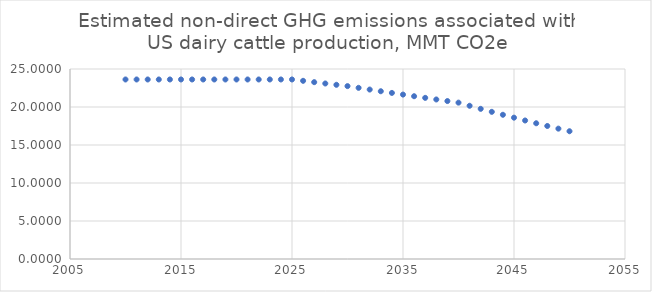
| Category | Estimated non-direct GHG emissions associated with US dairy cattle production, MMT CO2e |
|---|---|
| 2010.0 | 23.622 |
| 2011.0 | 23.622 |
| 2012.0 | 23.622 |
| 2013.0 | 23.622 |
| 2014.0 | 23.622 |
| 2015.0 | 23.622 |
| 2016.0 | 23.622 |
| 2017.0 | 23.622 |
| 2018.0 | 23.622 |
| 2019.0 | 23.622 |
| 2020.0 | 23.622 |
| 2021.0 | 23.622 |
| 2022.0 | 23.622 |
| 2023.0 | 23.622 |
| 2024.0 | 23.622 |
| 2025.0 | 23.622 |
| 2026.0 | 23.445 |
| 2027.0 | 23.269 |
| 2028.0 | 23.094 |
| 2029.0 | 22.921 |
| 2030.0 | 22.749 |
| 2031.0 | 22.522 |
| 2032.0 | 22.296 |
| 2033.0 | 22.073 |
| 2034.0 | 21.853 |
| 2035.0 | 21.634 |
| 2036.0 | 21.418 |
| 2037.0 | 21.204 |
| 2038.0 | 20.992 |
| 2039.0 | 20.782 |
| 2040.0 | 20.574 |
| 2041.0 | 20.162 |
| 2042.0 | 19.759 |
| 2043.0 | 19.364 |
| 2044.0 | 18.977 |
| 2045.0 | 18.597 |
| 2046.0 | 18.225 |
| 2047.0 | 17.861 |
| 2048.0 | 17.503 |
| 2049.0 | 17.153 |
| 2050.0 | 16.81 |